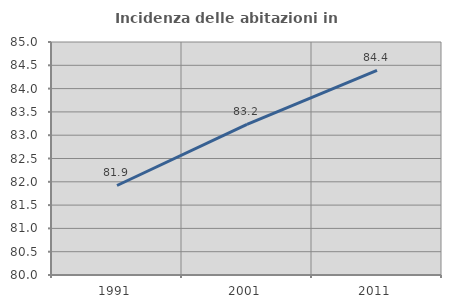
| Category | Incidenza delle abitazioni in proprietà  |
|---|---|
| 1991.0 | 81.921 |
| 2001.0 | 83.234 |
| 2011.0 | 84.393 |